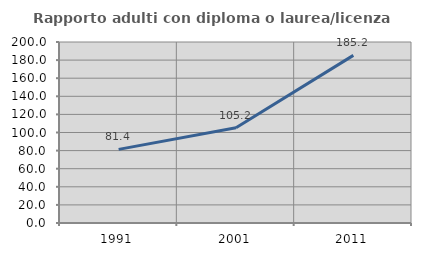
| Category | Rapporto adulti con diploma o laurea/licenza media  |
|---|---|
| 1991.0 | 81.364 |
| 2001.0 | 105.167 |
| 2011.0 | 185.196 |